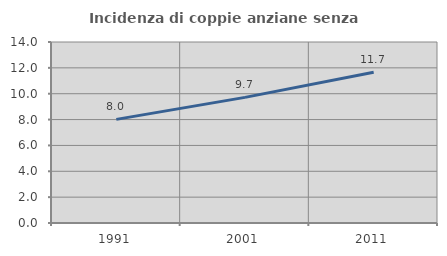
| Category | Incidenza di coppie anziane senza figli  |
|---|---|
| 1991.0 | 8.015 |
| 2001.0 | 9.717 |
| 2011.0 | 11.661 |